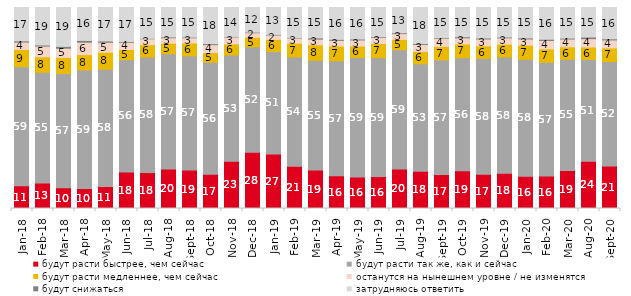
| Category | будут расти быстрее, чем сейчас | будут расти так же, как и сейчас | будут расти медленнее, чем сейчас | останутся на нынешнем уровне / не изменятся | будут снижаться | затрудняюсь ответить |
|---|---|---|---|---|---|---|
| 2018-01-01 | 11.35 | 59.2 | 8.6 | 3.65 | 0.6 | 16.6 |
| 2018-02-01 | 12.7 | 55.05 | 7.75 | 5.3 | 0.55 | 18.65 |
| 2018-03-01 | 10.3 | 56.85 | 8 | 4.6 | 0.9 | 19.35 |
| 2018-04-01 | 9.9 | 59 | 7.65 | 6.2 | 0.85 | 16.4 |
| 2018-05-01 | 10.95 | 58.4 | 8.4 | 4.95 | 0.65 | 16.65 |
| 2018-06-01 | 18.15 | 55.9 | 5.05 | 3.6 | 0.4 | 16.9 |
| 2018-07-01 | 17.85 | 57.5 | 6.15 | 2.95 | 0.2 | 15.35 |
| 2018-08-01 | 19.65 | 57.35 | 5.25 | 2.7 | 0.4 | 14.65 |
| 2018-09-01 | 19.1 | 56.85 | 6.4 | 2.6 | 0.3 | 14.75 |
| 2018-10-01 | 17.1 | 55.65 | 4.8 | 3.95 | 0.5 | 18 |
| 2018-11-01 | 23.453 | 52.894 | 5.539 | 3.443 | 0.2 | 14.471 |
| 2018-12-01 | 27.95 | 52.45 | 4.8 | 2.25 | 0.3 | 12.25 |
| 2019-01-01 | 27.15 | 50.9 | 6.1 | 2.15 | 0.3 | 13.4 |
| 2019-02-01 | 21.05 | 54.35 | 6.85 | 2.55 | 0.2 | 15 |
| 2019-03-01 | 19.095 | 54.649 | 7.708 | 2.834 | 0.597 | 15.117 |
| 2019-04-01 | 16.287 | 57.178 | 7.376 | 2.822 | 0.495 | 15.842 |
| 2019-05-01 | 15.701 | 59.435 | 5.646 | 3.071 | 0.446 | 15.701 |
| 2019-06-01 | 15.86 | 59.202 | 6.983 | 3.092 | 0.349 | 14.514 |
| 2019-07-01 | 19.604 | 59.406 | 5.099 | 2.921 | 0.396 | 12.574 |
| 2019-08-01 | 18.482 | 53.497 | 6.194 | 3.447 | 0.45 | 17.932 |
| 2019-09-01 | 16.881 | 57.079 | 6.683 | 4.01 | 0.297 | 15.05 |
| 2019-10-01 | 18.762 | 56.238 | 6.832 | 3.069 | 0.545 | 14.554 |
| 2019-11-01 | 17.03 | 57.673 | 6.238 | 3.416 | 0.446 | 15.198 |
| 2019-12-01 | 17.574 | 57.822 | 6.386 | 3.119 | 0.396 | 14.703 |
| 2020-01-01 | 15.99 | 58.267 | 6.98 | 3.119 | 0.495 | 15.149 |
| 2020-02-01 | 16.139 | 56.584 | 6.683 | 4.208 | 0.594 | 15.792 |
| 2020-03-01 | 18.939 | 55.28 | 6.197 | 3.917 | 0.446 | 15.221 |
| 2020-08-01 | 23.535 | 50.596 | 6.207 | 4.171 | 0.794 | 14.697 |
| 2020-09-01 | 21.105 | 51.966 | 6.819 | 3.982 | 0.548 | 15.58 |